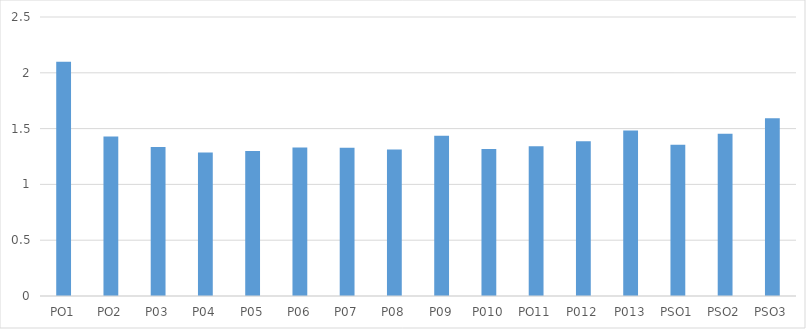
| Category | Series 0 |
|---|---|
| PO1 | 2.1 |
| PO2 | 1.43 |
| P03 | 1.335 |
| P04 | 1.286 |
| P05 | 1.299 |
| P06 | 1.33 |
| P07 | 1.329 |
| P08 | 1.312 |
| P09 | 1.436 |
| P010 | 1.318 |
| PO11 | 1.341 |
| P012 | 1.386 |
| P013 | 1.484 |
| PSO1 | 1.356 |
| PSO2 | 1.453 |
| PSO3 | 1.593 |